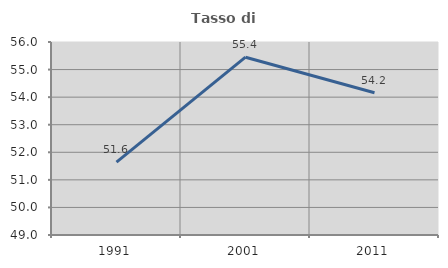
| Category | Tasso di occupazione   |
|---|---|
| 1991.0 | 51.64 |
| 2001.0 | 55.449 |
| 2011.0 | 54.16 |